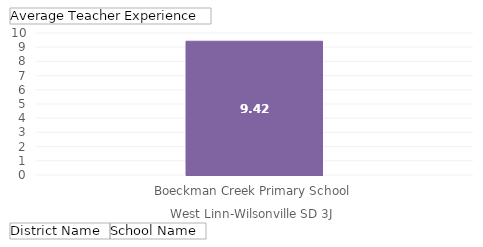
| Category | Total |
|---|---|
| 0 | 9.42 |